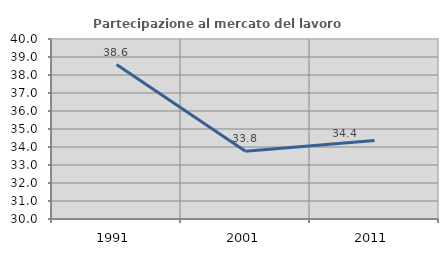
| Category | Partecipazione al mercato del lavoro  femminile |
|---|---|
| 1991.0 | 38.581 |
| 2001.0 | 33.763 |
| 2011.0 | 34.355 |